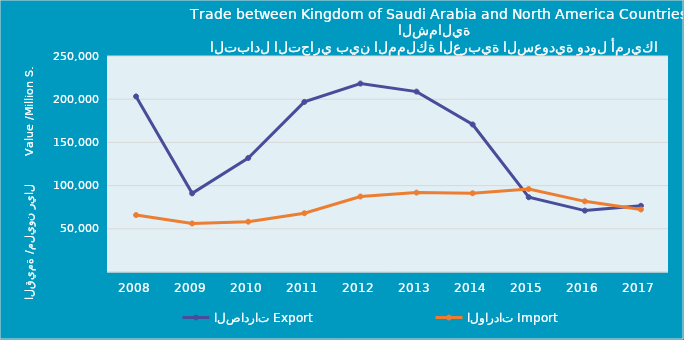
| Category | الصادرات | الواردات |
|---|---|---|
| 2008.0 | 203206626846 | 65903254020 |
| 2009.0 | 91014328897 | 56167416990 |
| 2010.0 | 131997284899 | 58216407588 |
| 2011.0 | 196844000203 | 68009808566 |
| 2012.0 | 218096654598 | 87344142831 |
| 2013.0 | 208773756364 | 91884765827 |
| 2014.0 | 170750851869 | 91164839626 |
| 2015.0 | 86533127258 | 96000282289 |
| 2016.0 | 71054442501 | 81762572694 |
| 2017.0 | 76623459924 | 72347433070 |